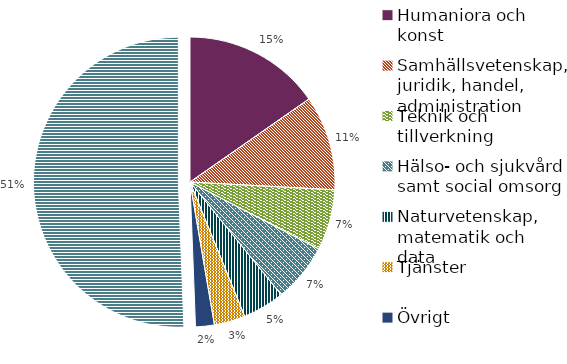
| Category | Series 0 |
|---|---|
| Humaniora och konst | 0.153 |
| Samhällsvetenskap, juridik, handel, administration | 0.106 |
| Teknik och tillverkning | 0.068 |
| Hälso- och sjukvård samt social omsorg | 0.065 |
| Naturvetenskap, matematik och data | 0.047 |
| Tjänster | 0.035 |
| Övrigt | 0.021 |
| Saknar eftergymnasial utbildning | 0.506 |